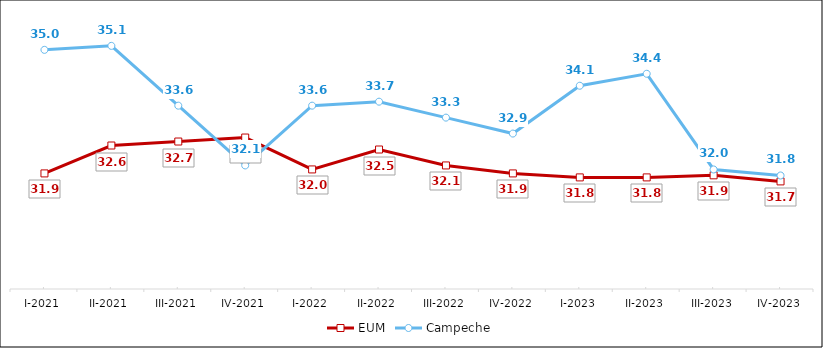
| Category | EUM | Campeche |
|---|---|---|
| I-2021 | 31.9 | 35 |
| II-2021 | 32.6 | 35.1 |
| III-2021 | 32.7 | 33.6 |
| IV-2021 | 32.8 | 32.1 |
| I-2022 | 32 | 33.6 |
| II-2022 | 32.5 | 33.7 |
| III-2022 | 32.1 | 33.3 |
| IV-2022 | 31.9 | 32.9 |
| I-2023 | 31.8 | 34.1 |
| II-2023 | 31.8 | 34.4 |
| III-2023 | 31.852 | 31.999 |
| IV-2023 | 31.7 | 31.848 |